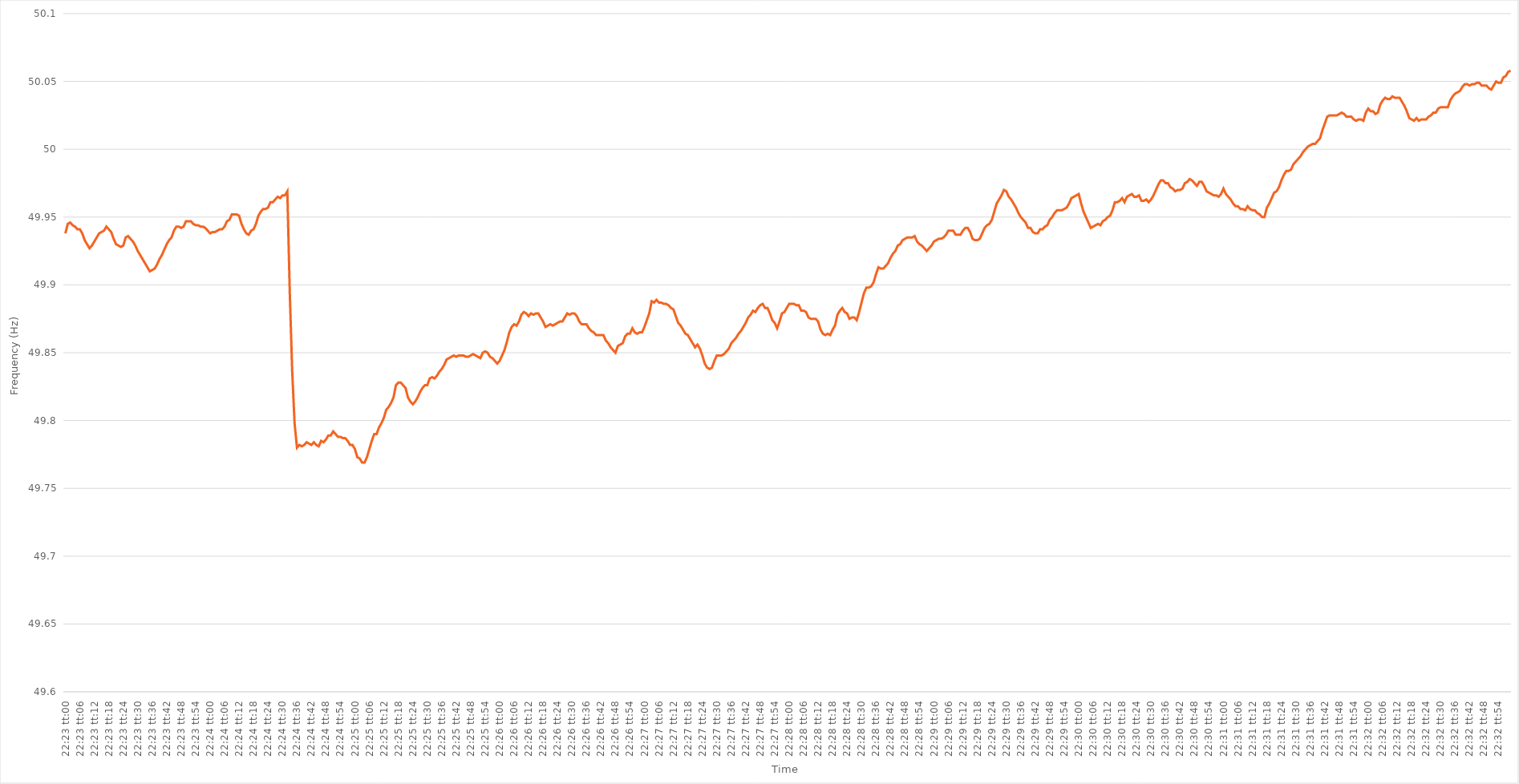
| Category | Series 0 |
|---|---|
| 0.9326388888888889 | 49.938 |
| 0.932650462962963 | 49.945 |
| 0.9326620370370371 | 49.946 |
| 0.932673611111111 | 49.944 |
| 0.9326851851851852 | 49.943 |
| 0.9326967592592593 | 49.941 |
| 0.9327083333333334 | 49.941 |
| 0.9327199074074074 | 49.938 |
| 0.9327314814814814 | 49.933 |
| 0.9327430555555556 | 49.93 |
| 0.9327546296296297 | 49.927 |
| 0.9327662037037037 | 49.929 |
| 0.9327777777777778 | 49.932 |
| 0.9327893518518519 | 49.935 |
| 0.9328009259259259 | 49.938 |
| 0.9328124999999999 | 49.939 |
| 0.9328240740740741 | 49.94 |
| 0.9328356481481482 | 49.943 |
| 0.9328472222222222 | 49.941 |
| 0.9328587962962963 | 49.939 |
| 0.9328703703703703 | 49.934 |
| 0.9328819444444445 | 49.93 |
| 0.9328935185185184 | 49.929 |
| 0.9329050925925926 | 49.928 |
| 0.9329166666666667 | 49.929 |
| 0.9329282407407408 | 49.935 |
| 0.9329398148148148 | 49.936 |
| 0.9329513888888888 | 49.934 |
| 0.932962962962963 | 49.932 |
| 0.9329745370370371 | 49.929 |
| 0.9329861111111111 | 49.925 |
| 0.9329976851851852 | 49.922 |
| 0.9330092592592593 | 49.919 |
| 0.9330208333333333 | 49.916 |
| 0.9330324074074073 | 49.913 |
| 0.9330439814814815 | 49.91 |
| 0.9330555555555556 | 49.911 |
| 0.9330671296296296 | 49.912 |
| 0.9330787037037037 | 49.915 |
| 0.9330902777777778 | 49.919 |
| 0.9331018518518519 | 49.922 |
| 0.9331134259259258 | 49.926 |
| 0.933125 | 49.93 |
| 0.9331365740740741 | 49.933 |
| 0.9331481481481482 | 49.935 |
| 0.9331597222222222 | 49.94 |
| 0.9331712962962962 | 49.943 |
| 0.9331828703703704 | 49.943 |
| 0.9331944444444445 | 49.942 |
| 0.9332060185185185 | 49.943 |
| 0.9332175925925926 | 49.947 |
| 0.9332291666666667 | 49.947 |
| 0.9332407407407407 | 49.947 |
| 0.9332523148148147 | 49.945 |
| 0.9332638888888889 | 49.944 |
| 0.933275462962963 | 49.944 |
| 0.933287037037037 | 49.943 |
| 0.9332986111111111 | 49.943 |
| 0.9333101851851852 | 49.942 |
| 0.9333217592592593 | 49.94 |
| 0.9333333333333332 | 49.938 |
| 0.9333449074074074 | 49.939 |
| 0.9333564814814815 | 49.939 |
| 0.9333680555555556 | 49.94 |
| 0.9333796296296296 | 49.941 |
| 0.9333912037037037 | 49.941 |
| 0.9334027777777778 | 49.943 |
| 0.933414351851852 | 49.947 |
| 0.9334259259259259 | 49.948 |
| 0.9334375 | 49.952 |
| 0.9334490740740741 | 49.952 |
| 0.9334606481481482 | 49.952 |
| 0.9334722222222221 | 49.951 |
| 0.9334837962962963 | 49.945 |
| 0.9334953703703704 | 49.941 |
| 0.9335069444444444 | 49.938 |
| 0.9335185185185185 | 49.937 |
| 0.9335300925925926 | 49.94 |
| 0.9335416666666667 | 49.941 |
| 0.9335532407407406 | 49.945 |
| 0.9335648148148148 | 49.951 |
| 0.9335763888888889 | 49.954 |
| 0.933587962962963 | 49.956 |
| 0.933599537037037 | 49.956 |
| 0.9336111111111111 | 49.957 |
| 0.9336226851851852 | 49.961 |
| 0.9336342592592594 | 49.961 |
| 0.9336458333333333 | 49.963 |
| 0.9336574074074074 | 49.965 |
| 0.9336689814814815 | 49.964 |
| 0.9336805555555556 | 49.966 |
| 0.9336921296296296 | 49.966 |
| 0.9337037037037037 | 49.969 |
| 0.9337152777777779 | 49.895 |
| 0.9337268518518518 | 49.837 |
| 0.9337384259259259 | 49.798 |
| 0.93375 | 49.78 |
| 0.9337615740740741 | 49.782 |
| 0.933773148148148 | 49.781 |
| 0.9337847222222222 | 49.782 |
| 0.9337962962962963 | 49.784 |
| 0.9338078703703704 | 49.783 |
| 0.9338194444444444 | 49.782 |
| 0.9338310185185185 | 49.784 |
| 0.9338425925925926 | 49.782 |
| 0.9338541666666668 | 49.781 |
| 0.9338657407407407 | 49.785 |
| 0.9338773148148148 | 49.784 |
| 0.9338888888888889 | 49.786 |
| 0.933900462962963 | 49.789 |
| 0.933912037037037 | 49.789 |
| 0.9339236111111111 | 49.792 |
| 0.9339351851851853 | 49.79 |
| 0.9339467592592593 | 49.788 |
| 0.9339583333333333 | 49.788 |
| 0.9339699074074074 | 49.787 |
| 0.9339814814814815 | 49.787 |
| 0.9339930555555555 | 49.785 |
| 0.9340046296296296 | 49.782 |
| 0.9340162037037038 | 49.782 |
| 0.9340277777777778 | 49.779 |
| 0.9340393518518518 | 49.773 |
| 0.9340509259259259 | 49.772 |
| 0.9340625 | 49.769 |
| 0.9340740740740742 | 49.769 |
| 0.9340856481481481 | 49.773 |
| 0.9340972222222222 | 49.779 |
| 0.9341087962962963 | 49.785 |
| 0.9341203703703704 | 49.79 |
| 0.9341319444444444 | 49.79 |
| 0.9341435185185185 | 49.795 |
| 0.9341550925925927 | 49.798 |
| 0.9341666666666667 | 49.802 |
| 0.9341782407407407 | 49.808 |
| 0.9341898148148148 | 49.81 |
| 0.9342013888888889 | 49.813 |
| 0.9342129629629629 | 49.817 |
| 0.934224537037037 | 49.826 |
| 0.9342361111111112 | 49.828 |
| 0.9342476851851852 | 49.828 |
| 0.9342592592592592 | 49.826 |
| 0.9342708333333333 | 49.824 |
| 0.9342824074074074 | 49.817 |
| 0.9342939814814816 | 49.814 |
| 0.9343055555555555 | 49.812 |
| 0.9343171296296297 | 49.814 |
| 0.9343287037037037 | 49.817 |
| 0.9343402777777778 | 49.821 |
| 0.9343518518518518 | 49.824 |
| 0.9343634259259259 | 49.826 |
| 0.9343750000000001 | 49.826 |
| 0.9343865740740741 | 49.831 |
| 0.9343981481481481 | 49.832 |
| 0.9344097222222222 | 49.831 |
| 0.9344212962962963 | 49.833 |
| 0.9344328703703703 | 49.836 |
| 0.9344444444444444 | 49.838 |
| 0.9344560185185186 | 49.841 |
| 0.9344675925925926 | 49.845 |
| 0.9344791666666666 | 49.846 |
| 0.9344907407407407 | 49.847 |
| 0.9345023148148148 | 49.848 |
| 0.934513888888889 | 49.847 |
| 0.9345254629629629 | 49.848 |
| 0.934537037037037 | 49.848 |
| 0.9345486111111111 | 49.848 |
| 0.9345601851851852 | 49.847 |
| 0.9345717592592592 | 49.847 |
| 0.9345833333333333 | 49.848 |
| 0.9345949074074075 | 49.849 |
| 0.9346064814814815 | 49.848 |
| 0.9346180555555555 | 49.847 |
| 0.9346296296296296 | 49.846 |
| 0.9346412037037037 | 49.85 |
| 0.9346527777777777 | 49.851 |
| 0.9346643518518518 | 49.85 |
| 0.934675925925926 | 49.847 |
| 0.9346875 | 49.846 |
| 0.934699074074074 | 49.844 |
| 0.9347106481481481 | 49.842 |
| 0.9347222222222222 | 49.844 |
| 0.9347337962962964 | 49.848 |
| 0.9347453703703703 | 49.852 |
| 0.9347569444444445 | 49.858 |
| 0.9347685185185185 | 49.865 |
| 0.9347800925925926 | 49.869 |
| 0.9347916666666666 | 49.871 |
| 0.9348032407407407 | 49.87 |
| 0.9348148148148149 | 49.873 |
| 0.9348263888888889 | 49.878 |
| 0.934837962962963 | 49.88 |
| 0.934849537037037 | 49.879 |
| 0.9348611111111111 | 49.877 |
| 0.9348726851851853 | 49.879 |
| 0.9348842592592592 | 49.878 |
| 0.9348958333333334 | 49.879 |
| 0.9349074074074074 | 49.879 |
| 0.9349189814814814 | 49.876 |
| 0.9349305555555555 | 49.873 |
| 0.9349421296296296 | 49.869 |
| 0.9349537037037038 | 49.87 |
| 0.9349652777777777 | 49.871 |
| 0.9349768518518519 | 49.87 |
| 0.9349884259259259 | 49.871 |
| 0.935 | 49.872 |
| 0.935011574074074 | 49.873 |
| 0.9350231481481481 | 49.873 |
| 0.9350347222222223 | 49.876 |
| 0.9350462962962963 | 49.879 |
| 0.9350578703703704 | 49.878 |
| 0.9350694444444444 | 49.879 |
| 0.9350810185185185 | 49.879 |
| 0.9350925925925927 | 49.877 |
| 0.9351041666666666 | 49.873 |
| 0.9351157407407408 | 49.871 |
| 0.9351273148148148 | 49.871 |
| 0.935138888888889 | 49.871 |
| 0.9351504629629629 | 49.868 |
| 0.935162037037037 | 49.866 |
| 0.9351736111111112 | 49.865 |
| 0.9351851851851851 | 49.863 |
| 0.9351967592592593 | 49.863 |
| 0.9352083333333333 | 49.863 |
| 0.9352199074074075 | 49.863 |
| 0.9352314814814814 | 49.859 |
| 0.9352430555555555 | 49.857 |
| 0.9352546296296297 | 49.854 |
| 0.9352662037037037 | 49.852 |
| 0.9352777777777778 | 49.85 |
| 0.9352893518518518 | 49.855 |
| 0.935300925925926 | 49.856 |
| 0.9353125000000001 | 49.857 |
| 0.935324074074074 | 49.862 |
| 0.9353356481481482 | 49.864 |
| 0.9353472222222222 | 49.864 |
| 0.9353587962962964 | 49.868 |
| 0.9353703703703703 | 49.865 |
| 0.9353819444444444 | 49.864 |
| 0.9353935185185186 | 49.865 |
| 0.9354050925925925 | 49.865 |
| 0.9354166666666667 | 49.869 |
| 0.9354282407407407 | 49.874 |
| 0.9354398148148149 | 49.879 |
| 0.9354513888888888 | 49.888 |
| 0.9354629629629629 | 49.887 |
| 0.9354745370370371 | 49.889 |
| 0.9354861111111111 | 49.887 |
| 0.9354976851851852 | 49.887 |
| 0.9355092592592592 | 49.886 |
| 0.9355208333333334 | 49.886 |
| 0.9355324074074075 | 49.885 |
| 0.9355439814814814 | 49.883 |
| 0.9355555555555556 | 49.882 |
| 0.9355671296296296 | 49.877 |
| 0.9355787037037038 | 49.872 |
| 0.9355902777777777 | 49.87 |
| 0.9356018518518519 | 49.867 |
| 0.935613425925926 | 49.864 |
| 0.9356249999999999 | 49.863 |
| 0.9356365740740741 | 49.86 |
| 0.9356481481481481 | 49.857 |
| 0.9356597222222223 | 49.854 |
| 0.9356712962962962 | 49.856 |
| 0.9356828703703703 | 49.853 |
| 0.9356944444444445 | 49.848 |
| 0.9357060185185185 | 49.842 |
| 0.9357175925925926 | 49.839 |
| 0.9357291666666666 | 49.838 |
| 0.9357407407407408 | 49.839 |
| 0.9357523148148149 | 49.844 |
| 0.9357638888888888 | 49.848 |
| 0.935775462962963 | 49.848 |
| 0.935787037037037 | 49.848 |
| 0.9357986111111112 | 49.849 |
| 0.9358101851851851 | 49.851 |
| 0.9358217592592593 | 49.853 |
| 0.9358333333333334 | 49.857 |
| 0.9358449074074073 | 49.859 |
| 0.9358564814814815 | 49.861 |
| 0.9358680555555555 | 49.864 |
| 0.9358796296296297 | 49.866 |
| 0.9358912037037036 | 49.869 |
| 0.9359027777777778 | 49.872 |
| 0.9359143518518519 | 49.876 |
| 0.9359259259259259 | 49.878 |
| 0.9359375 | 49.881 |
| 0.935949074074074 | 49.88 |
| 0.9359606481481482 | 49.883 |
| 0.9359722222222223 | 49.885 |
| 0.9359837962962962 | 49.886 |
| 0.9359953703703704 | 49.883 |
| 0.9360069444444444 | 49.883 |
| 0.9360185185185186 | 49.879 |
| 0.9360300925925925 | 49.874 |
| 0.9360416666666667 | 49.872 |
| 0.9360532407407408 | 49.868 |
| 0.9360648148148148 | 49.873 |
| 0.9360763888888889 | 49.879 |
| 0.9360879629629629 | 49.88 |
| 0.9360995370370371 | 49.883 |
| 0.936111111111111 | 49.886 |
| 0.9361226851851852 | 49.886 |
| 0.9361342592592593 | 49.886 |
| 0.9361458333333333 | 49.885 |
| 0.9361574074074074 | 49.885 |
| 0.9361689814814814 | 49.881 |
| 0.9361805555555556 | 49.881 |
| 0.9361921296296297 | 49.88 |
| 0.9362037037037036 | 49.876 |
| 0.9362152777777778 | 49.875 |
| 0.9362268518518518 | 49.875 |
| 0.936238425925926 | 49.875 |
| 0.9362499999999999 | 49.873 |
| 0.9362615740740741 | 49.867 |
| 0.9362731481481482 | 49.864 |
| 0.9362847222222223 | 49.863 |
| 0.9362962962962963 | 49.864 |
| 0.9363078703703703 | 49.863 |
| 0.9363194444444445 | 49.867 |
| 0.9363310185185184 | 49.87 |
| 0.9363425925925926 | 49.878 |
| 0.9363541666666667 | 49.881 |
| 0.9363657407407407 | 49.883 |
| 0.9363773148148148 | 49.88 |
| 0.9363888888888888 | 49.879 |
| 0.936400462962963 | 49.875 |
| 0.9364120370370371 | 49.876 |
| 0.936423611111111 | 49.876 |
| 0.9364351851851852 | 49.874 |
| 0.9364467592592592 | 49.88 |
| 0.9364583333333334 | 49.887 |
| 0.9364699074074073 | 49.894 |
| 0.9364814814814815 | 49.898 |
| 0.9364930555555556 | 49.898 |
| 0.9365046296296297 | 49.899 |
| 0.9365162037037037 | 49.902 |
| 0.9365277777777777 | 49.908 |
| 0.9365393518518519 | 49.913 |
| 0.936550925925926 | 49.912 |
| 0.9365625 | 49.912 |
| 0.9365740740740741 | 49.914 |
| 0.9365856481481482 | 49.916 |
| 0.9365972222222222 | 49.92 |
| 0.9366087962962962 | 49.923 |
| 0.9366203703703704 | 49.925 |
| 0.9366319444444445 | 49.929 |
| 0.9366435185185185 | 49.93 |
| 0.9366550925925926 | 49.933 |
| 0.9366666666666666 | 49.934 |
| 0.9366782407407408 | 49.935 |
| 0.9366898148148147 | 49.935 |
| 0.9367013888888889 | 49.935 |
| 0.936712962962963 | 49.936 |
| 0.9367245370370371 | 49.932 |
| 0.9367361111111111 | 49.93 |
| 0.9367476851851851 | 49.929 |
| 0.9367592592592593 | 49.927 |
| 0.9367708333333334 | 49.925 |
| 0.9367824074074074 | 49.927 |
| 0.9367939814814815 | 49.929 |
| 0.9368055555555556 | 49.932 |
| 0.9368171296296296 | 49.933 |
| 0.9368287037037036 | 49.934 |
| 0.9368402777777778 | 49.934 |
| 0.9368518518518519 | 49.935 |
| 0.9368634259259259 | 49.937 |
| 0.936875 | 49.94 |
| 0.936886574074074 | 49.94 |
| 0.9368981481481482 | 49.94 |
| 0.9369097222222221 | 49.937 |
| 0.9369212962962963 | 49.937 |
| 0.9369328703703704 | 49.937 |
| 0.9369444444444445 | 49.94 |
| 0.9369560185185185 | 49.942 |
| 0.9369675925925925 | 49.942 |
| 0.9369791666666667 | 49.939 |
| 0.9369907407407408 | 49.934 |
| 0.9370023148148148 | 49.933 |
| 0.9370138888888889 | 49.933 |
| 0.937025462962963 | 49.934 |
| 0.937037037037037 | 49.938 |
| 0.937048611111111 | 49.942 |
| 0.9370601851851852 | 49.944 |
| 0.9370717592592593 | 49.945 |
| 0.9370833333333333 | 49.948 |
| 0.9370949074074074 | 49.954 |
| 0.9371064814814815 | 49.96 |
| 0.9371180555555556 | 49.963 |
| 0.9371296296296295 | 49.966 |
| 0.9371412037037037 | 49.97 |
| 0.9371527777777778 | 49.969 |
| 0.9371643518518519 | 49.965 |
| 0.9371759259259259 | 49.963 |
| 0.9371875 | 49.96 |
| 0.9371990740740741 | 49.957 |
| 0.9372106481481483 | 49.953 |
| 0.9372222222222222 | 49.95 |
| 0.9372337962962963 | 49.948 |
| 0.9372453703703704 | 49.946 |
| 0.9372569444444444 | 49.942 |
| 0.9372685185185184 | 49.942 |
| 0.9372800925925926 | 49.939 |
| 0.9372916666666667 | 49.938 |
| 0.9373032407407407 | 49.938 |
| 0.9373148148148148 | 49.941 |
| 0.9373263888888889 | 49.941 |
| 0.937337962962963 | 49.943 |
| 0.9373495370370369 | 49.944 |
| 0.9373611111111111 | 49.948 |
| 0.9373726851851852 | 49.95 |
| 0.9373842592592593 | 49.953 |
| 0.9373958333333333 | 49.955 |
| 0.9374074074074074 | 49.955 |
| 0.9374189814814815 | 49.955 |
| 0.9374305555555557 | 49.956 |
| 0.9374421296296296 | 49.957 |
| 0.9374537037037037 | 49.96 |
| 0.9374652777777778 | 49.964 |
| 0.9374768518518519 | 49.965 |
| 0.9374884259259259 | 49.966 |
| 0.9375 | 49.967 |
| 0.9375115740740741 | 49.96 |
| 0.9375231481481481 | 49.954 |
| 0.9375347222222222 | 49.95 |
| 0.9375462962962963 | 49.946 |
| 0.9375578703703704 | 49.942 |
| 0.9375694444444443 | 49.943 |
| 0.9375810185185185 | 49.944 |
| 0.9375925925925926 | 49.945 |
| 0.9376041666666667 | 49.944 |
| 0.9376157407407407 | 49.947 |
| 0.9376273148148148 | 49.948 |
| 0.9376388888888889 | 49.95 |
| 0.9376504629629631 | 49.951 |
| 0.937662037037037 | 49.955 |
| 0.9376736111111111 | 49.961 |
| 0.9376851851851852 | 49.961 |
| 0.9376967592592593 | 49.962 |
| 0.9377083333333333 | 49.964 |
| 0.9377199074074074 | 49.961 |
| 0.9377314814814816 | 49.965 |
| 0.9377430555555556 | 49.966 |
| 0.9377546296296296 | 49.967 |
| 0.9377662037037037 | 49.965 |
| 0.9377777777777778 | 49.965 |
| 0.9377893518518517 | 49.966 |
| 0.9378009259259259 | 49.962 |
| 0.9378125 | 49.962 |
| 0.9378240740740741 | 49.963 |
| 0.9378356481481481 | 49.961 |
| 0.9378472222222222 | 49.963 |
| 0.9378587962962963 | 49.966 |
| 0.9378703703703705 | 49.97 |
| 0.9378819444444444 | 49.974 |
| 0.9378935185185185 | 49.977 |
| 0.9379050925925926 | 49.977 |
| 0.9379166666666667 | 49.975 |
| 0.9379282407407407 | 49.975 |
| 0.9379398148148148 | 49.972 |
| 0.937951388888889 | 49.971 |
| 0.937962962962963 | 49.969 |
| 0.937974537037037 | 49.97 |
| 0.9379861111111111 | 49.97 |
| 0.9379976851851852 | 49.971 |
| 0.9380092592592592 | 49.975 |
| 0.9380208333333333 | 49.976 |
| 0.9380324074074075 | 49.978 |
| 0.9380439814814815 | 49.977 |
| 0.9380555555555555 | 49.975 |
| 0.9380671296296296 | 49.973 |
| 0.9380787037037037 | 49.976 |
| 0.9380902777777779 | 49.976 |
| 0.9381018518518518 | 49.973 |
| 0.938113425925926 | 49.969 |
| 0.938125 | 49.968 |
| 0.9381365740740741 | 49.967 |
| 0.9381481481481481 | 49.966 |
| 0.9381597222222222 | 49.966 |
| 0.9381712962962964 | 49.965 |
| 0.9381828703703704 | 49.967 |
| 0.9381944444444444 | 49.971 |
| 0.9382060185185185 | 49.967 |
| 0.9382175925925926 | 49.965 |
| 0.9382291666666666 | 49.963 |
| 0.9382407407407407 | 49.96 |
| 0.9382523148148149 | 49.958 |
| 0.9382638888888889 | 49.958 |
| 0.9382754629629629 | 49.956 |
| 0.938287037037037 | 49.956 |
| 0.9382986111111111 | 49.955 |
| 0.9383101851851853 | 49.958 |
| 0.9383217592592592 | 49.956 |
| 0.9383333333333334 | 49.955 |
| 0.9383449074074074 | 49.955 |
| 0.9383564814814815 | 49.953 |
| 0.9383680555555555 | 49.952 |
| 0.9383796296296296 | 49.95 |
| 0.9383912037037038 | 49.95 |
| 0.9384027777777778 | 49.957 |
| 0.9384143518518518 | 49.96 |
| 0.9384259259259259 | 49.964 |
| 0.9384375 | 49.968 |
| 0.938449074074074 | 49.969 |
| 0.9384606481481481 | 49.972 |
| 0.9384722222222223 | 49.977 |
| 0.9384837962962963 | 49.981 |
| 0.9384953703703703 | 49.984 |
| 0.9385069444444444 | 49.984 |
| 0.9385185185185185 | 49.985 |
| 0.9385300925925927 | 49.989 |
| 0.9385416666666666 | 49.991 |
| 0.9385532407407408 | 49.993 |
| 0.9385648148148148 | 49.995 |
| 0.938576388888889 | 49.998 |
| 0.9385879629629629 | 50 |
| 0.938599537037037 | 50.002 |
| 0.9386111111111112 | 50.003 |
| 0.9386226851851852 | 50.004 |
| 0.9386342592592593 | 50.004 |
| 0.9386458333333333 | 50.006 |
| 0.9386574074074074 | 50.008 |
| 0.9386689814814816 | 50.014 |
| 0.9386805555555555 | 50.019 |
| 0.9386921296296297 | 50.024 |
| 0.9387037037037037 | 50.025 |
| 0.9387152777777777 | 50.025 |
| 0.9387268518518518 | 50.025 |
| 0.9387384259259259 | 50.025 |
| 0.9387500000000001 | 50.026 |
| 0.938761574074074 | 50.027 |
| 0.9387731481481482 | 50.026 |
| 0.9387847222222222 | 50.024 |
| 0.9387962962962964 | 50.024 |
| 0.9388078703703703 | 50.024 |
| 0.9388194444444444 | 50.022 |
| 0.9388310185185186 | 50.021 |
| 0.9388425925925926 | 50.022 |
| 0.9388541666666667 | 50.022 |
| 0.9388657407407407 | 50.021 |
| 0.9388773148148148 | 50.027 |
| 0.938888888888889 | 50.03 |
| 0.9389004629629629 | 50.028 |
| 0.9389120370370371 | 50.028 |
| 0.9389236111111111 | 50.026 |
| 0.9389351851851853 | 50.027 |
| 0.9389467592592592 | 50.033 |
| 0.9389583333333333 | 50.036 |
| 0.9389699074074075 | 50.038 |
| 0.9389814814814814 | 50.037 |
| 0.9389930555555556 | 50.037 |
| 0.9390046296296296 | 50.039 |
| 0.9390162037037038 | 50.038 |
| 0.9390277777777777 | 50.038 |
| 0.9390393518518518 | 50.038 |
| 0.939050925925926 | 50.035 |
| 0.9390625 | 50.032 |
| 0.9390740740740741 | 50.028 |
| 0.9390856481481481 | 50.023 |
| 0.9390972222222222 | 50.022 |
| 0.9391087962962964 | 50.021 |
| 0.9391203703703703 | 50.023 |
| 0.9391319444444445 | 50.021 |
| 0.9391435185185185 | 50.022 |
| 0.9391550925925927 | 50.022 |
| 0.9391666666666666 | 50.022 |
| 0.9391782407407407 | 50.024 |
| 0.9391898148148149 | 50.025 |
| 0.9392013888888888 | 50.027 |
| 0.939212962962963 | 50.027 |
| 0.939224537037037 | 50.03 |
| 0.9392361111111112 | 50.031 |
| 0.9392476851851851 | 50.031 |
| 0.9392592592592592 | 50.031 |
| 0.9392708333333334 | 50.031 |
| 0.9392824074074074 | 50.036 |
| 0.9392939814814815 | 50.039 |
| 0.9393055555555555 | 50.041 |
| 0.9393171296296297 | 50.042 |
| 0.9393287037037038 | 50.043 |
| 0.9393402777777777 | 50.046 |
| 0.9393518518518519 | 50.048 |
| 0.9393634259259259 | 50.048 |
| 0.9393750000000001 | 50.047 |
| 0.939386574074074 | 50.048 |
| 0.9393981481481481 | 50.048 |
| 0.9394097222222223 | 50.049 |
| 0.9394212962962962 | 50.049 |
| 0.9394328703703704 | 50.047 |
| 0.9394444444444444 | 50.047 |
| 0.9394560185185186 | 50.047 |
| 0.9394675925925925 | 50.045 |
| 0.9394791666666666 | 50.044 |
| 0.9394907407407408 | 50.047 |
| 0.9395023148148148 | 50.05 |
| 0.9395138888888889 | 50.049 |
| 0.9395254629629629 | 50.049 |
| 0.9395370370370371 | 50.053 |
| 0.9395486111111112 | 50.054 |
| 0.9395601851851851 | 50.057 |
| 0.9395717592592593 | 50.058 |